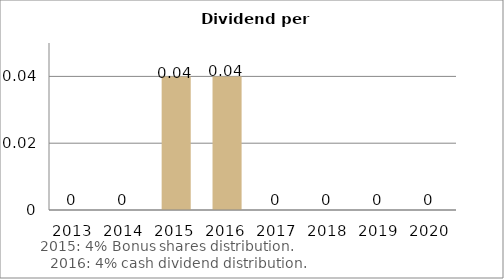
| Category | Series 0 |
|---|---|
| 2013.0 | 0 |
| 2014.0 | 0 |
| 2015.0 | 0.04 |
| 2016.0 | 0.04 |
| 2017.0 | 0 |
| 2018.0 | 0 |
| 2019.0 | 0 |
| 2020.0 | 0 |